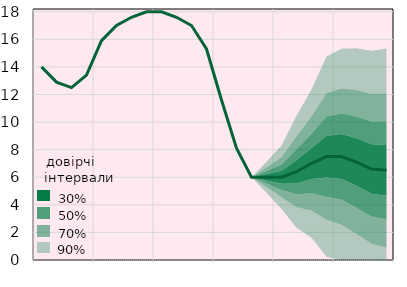
| Category | Облікова ставка, % | Series 11 |
|---|---|---|
|  | 14 |  |
|  | 12.9 |  |
|  | 12.5 |  |
| IV.17 | 13.4 |  |
|  | 15.9 |  |
|  | 17 |  |
|  | 17.6 |  |
| IV.18 | 18 |  |
|  | 18 |  |
|  | 17.6 |  |
|  | 17 |  |
| IV.19 | 15.3 |  |
|  | 11.6 |  |
|  | 8.1 |  |
|  | 6 |  |
| IV.20 | 6 |  |
|  | 6 |  |
|  | 6.4 |  |
|  | 7 |  |
| IV.21 | 7.5 |  |
|  | 7.5 |  |
|  | 7.1 |  |
|  | 6.6 |  |
| IV.22 | 6.5 |  |